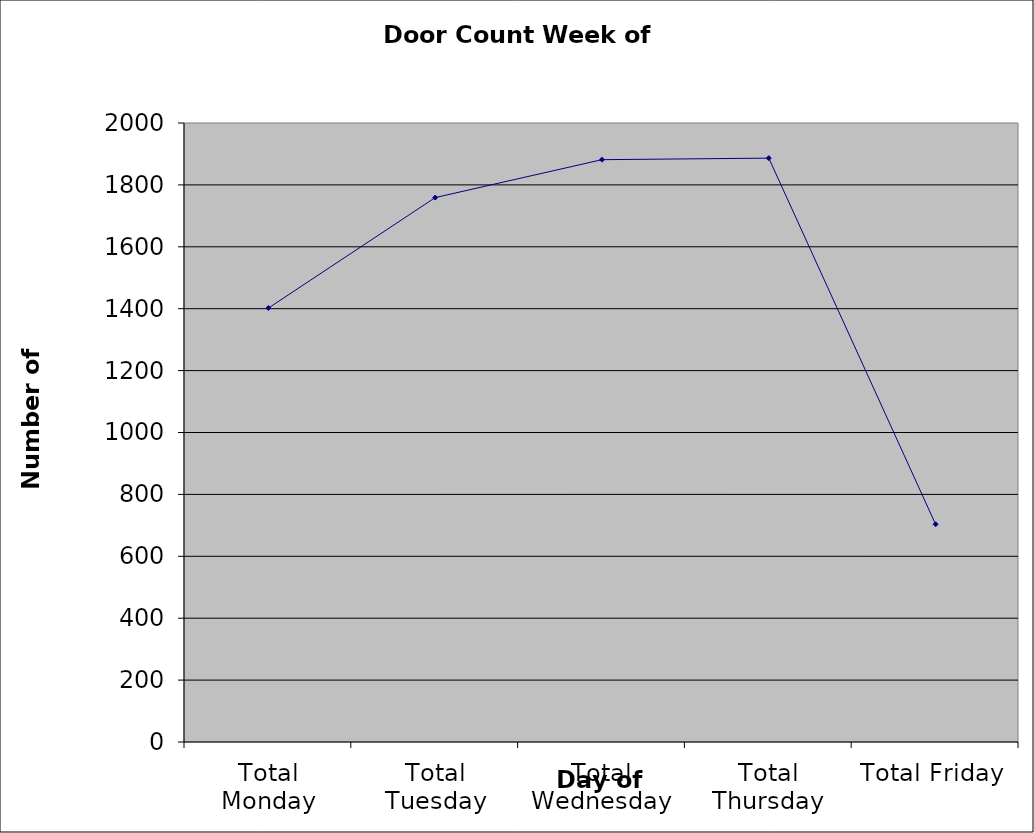
| Category | Series 0 |
|---|---|
| Total Monday | 1402 |
| Total Tuesday | 1759 |
| Total Wednesday | 1881.5 |
| Total Thursday | 1886.5 |
| Total Friday | 703.5 |